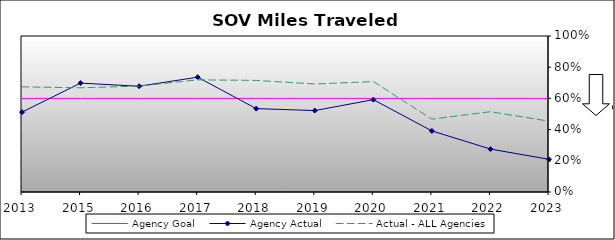
| Category | Agency Goal | Agency Actual | Actual - ALL Agencies |
|---|---|---|---|
| 2013.0 | 0.6 | 0.512 | 0.674 |
| 2015.0 | 0.6 | 0.698 | 0.668 |
| 2016.0 | 0.6 | 0.678 | 0.679 |
| 2017.0 | 0.6 | 0.736 | 0.719 |
| 2018.0 | 0.6 | 0.534 | 0.715 |
| 2019.0 | 0.6 | 0.522 | 0.692 |
| 2020.0 | 0.6 | 0.592 | 0.708 |
| 2021.0 | 0.6 | 0.392 | 0.467 |
| 2022.0 | 0.6 | 0.275 | 0.515 |
| 2023.0 | 0.6 | 0.21 | 0.454 |